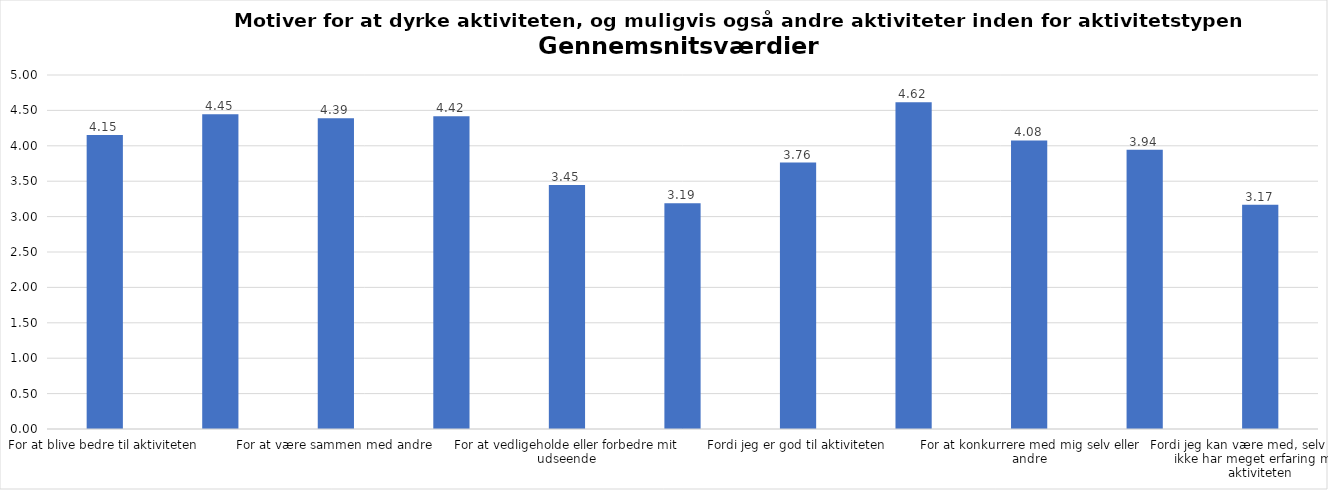
| Category | Gennemsnit |
|---|---|
| For at blive bedre til aktiviteten | 4.153 |
| For at vedligeholde eller forbedre min sundhed (fx helbred, fysisk form) | 4.447 |
| For at være sammen med andre | 4.391 |
| For at gøre noget godt for mig selv | 4.419 |
| For at vedligeholde eller forbedre mit udseende | 3.447 |
| Fordi andre i min omgangskreds opmuntrer mig til det | 3.187 |
| Fordi jeg er god til aktiviteten | 3.763 |
| Fordi jeg godt kan lide aktiviteten | 4.616 |
| For at konkurrere med mig selv eller andre | 4.075 |
| Fordi aktiviteten passer godt ind i min hverdag | 3.944 |
| Fordi jeg kan være med, selv om jeg ikke har meget erfaring med aktiviteten | 3.169 |